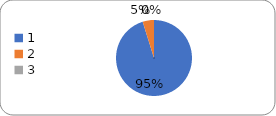
| Category | Series 0 |
|---|---|
| 0 | 79 |
| 1 | 4 |
| 2 | 0 |